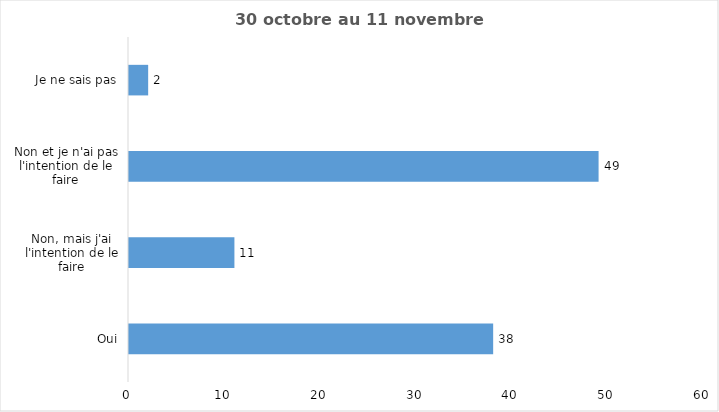
| Category | Series 0 |
|---|---|
| Oui | 38 |
| Non, mais j'ai l'intention de le faire | 11 |
| Non et je n'ai pas l'intention de le faire | 49 |
| Je ne sais pas | 2 |